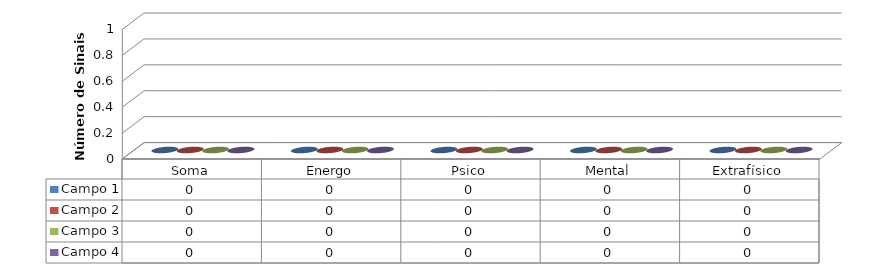
| Category | Campo 1 | Campo 2 | Campo 3 | Campo 4 |
|---|---|---|---|---|
| Soma | 0 | 0 | 0 | 0 |
| Energo | 0 | 0 | 0 | 0 |
| Psico | 0 | 0 | 0 | 0 |
| Mental | 0 | 0 | 0 | 0 |
| Extrafísico | 0 | 0 | 0 | 0 |